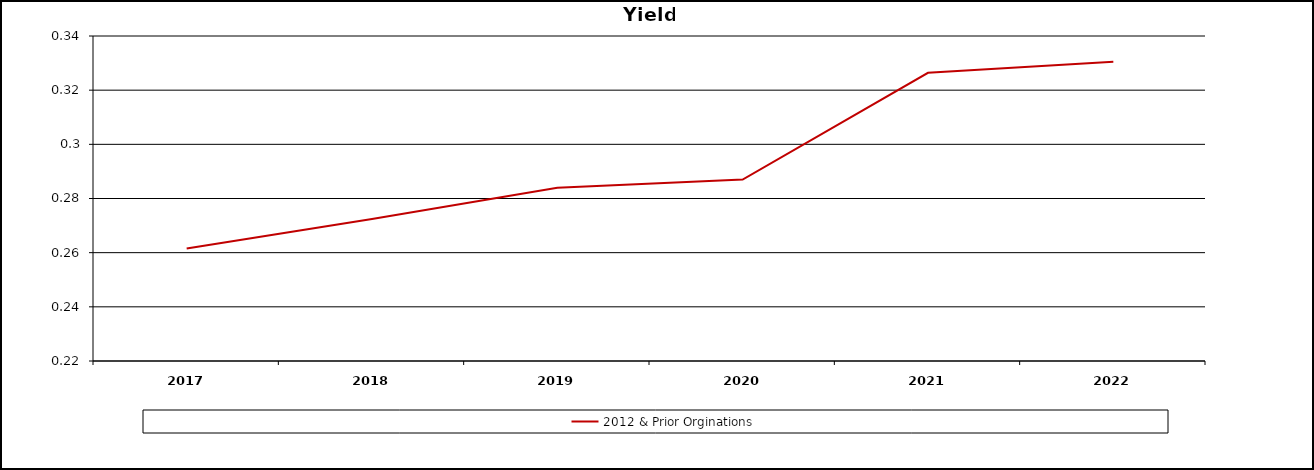
| Category | 2012 & Prior Orginations  |
|---|---|
| 2017.0 | 0.262 |
| 2018.0 | 0.272 |
| 2019.0 | 0.284 |
| 2020.0 | 0.287 |
| 2021.0 | 0.326 |
| 2022.0 | 0.33 |